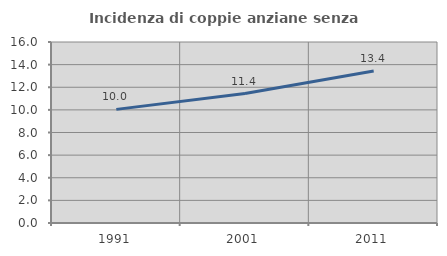
| Category | Incidenza di coppie anziane senza figli  |
|---|---|
| 1991.0 | 10.043 |
| 2001.0 | 11.443 |
| 2011.0 | 13.433 |